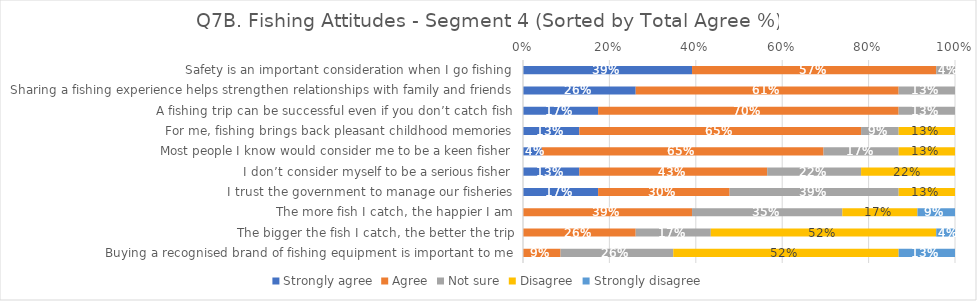
| Category | Strongly agree | Agree | Not sure | Disagree | Strongly disagree |
|---|---|---|---|---|---|
| Safety is an important consideration when I go fishing | 0.391 | 0.565 | 0.043 | 0 | 0 |
| Sharing a fishing experience helps strengthen relationships with family and friends | 0.261 | 0.609 | 0.13 | 0 | 0 |
| A fishing trip can be successful even if you don’t catch fish | 0.174 | 0.696 | 0.13 | 0 | 0 |
| For me, fishing brings back pleasant childhood memories | 0.13 | 0.652 | 0.087 | 0.13 | 0 |
| Most people I know would consider me to be a keen fisher | 0.043 | 0.652 | 0.174 | 0.13 | 0 |
| I don’t consider myself to be a serious fisher | 0.13 | 0.435 | 0.217 | 0.217 | 0 |
| I trust the government to manage our fisheries | 0.174 | 0.304 | 0.391 | 0.13 | 0 |
| The more fish I catch, the happier I am | 0 | 0.391 | 0.348 | 0.174 | 0.087 |
| The bigger the fish I catch, the better the trip | 0 | 0.261 | 0.174 | 0.522 | 0.043 |
| Buying a recognised brand of fishing equipment is important to me | 0 | 0.087 | 0.261 | 0.522 | 0.13 |